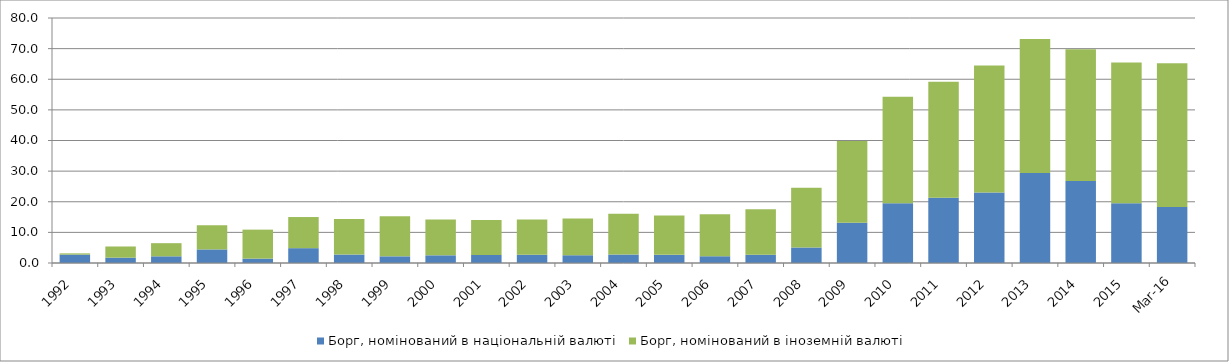
| Category | Борг, номінований в національній валюті | Борг, номінований в іноземній валюті |
|---|---|---|
| 1992.0 | 2.743 | 0.404 |
| 1993.0 | 1.732 | 3.661 |
| 1994.0 | 2.184 | 4.292 |
| 1995.0 | 4.433 | 7.895 |
| 1996.0 | 1.427 | 9.468 |
| 1997.0 | 4.845 | 10.164 |
| 1998.0 | 2.759 | 11.647 |
| 1999.0 | 2.176 | 13.072 |
| 2000.0 | 2.507 | 11.657 |
| 2001.0 | 2.65 | 11.419 |
| 2002.0 | 2.694 | 11.508 |
| 2003.0 | 2.533 | 12.01 |
| 2004.0 | 2.766 | 13.331 |
| 2005.0 | 2.666 | 12.809 |
| 2006.0 | 2.205 | 13.745 |
| 2007.0 | 2.69 | 14.883 |
| 2008.0 | 5.06 | 19.539 |
| 2009.0 | 13.143 | 26.67 |
| 2010.0 | 19.538 | 34.76 |
| 2011.0 | 21.329 | 37.894 |
| 2012.0 | 23.046 | 41.449 |
| 2013.0 | 29.397 | 43.765 |
| 2014.0 | 26.747 | 43.065 |
| 2015.0 | 19.515 | 45.99 |
| 42460.0 | 18.306 | 46.931 |